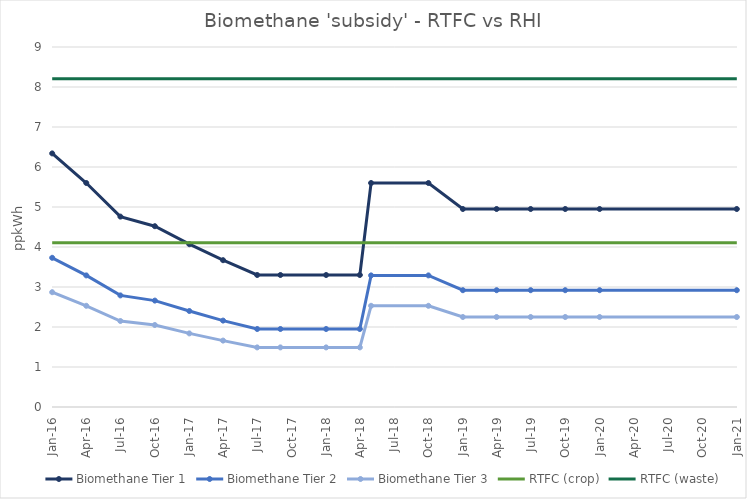
| Category | Biomethane Tier 1 | Biomethane Tier 2 | Biomethane Tier 3 | RTFC (crop) | RTFC (waste) |
|---|---|---|---|---|---|
| 2016-01-01 | 6.34 | 3.73 | 2.87 | 4.104 | 8.208 |
| 2016-04-01 | 5.6 | 3.29 | 2.53 | 4.104 | 8.208 |
| 2016-07-01 | 4.76 | 2.79 | 2.15 | 4.104 | 8.208 |
| 2016-10-01 | 4.52 | 2.66 | 2.05 | 4.104 | 8.208 |
| 2017-01-01 | 4.07 | 2.4 | 1.84 | 4.104 | 8.208 |
| 2017-04-01 | 3.67 | 2.16 | 1.66 | 4.104 | 8.208 |
| 2017-07-01 | 3.3 | 1.95 | 1.49 | 4.104 | 8.208 |
| 2017-09-01 | 3.3 | 1.95 | 1.49 | 4.104 | 8.208 |
| 2018-01-01 | 3.3 | 1.95 | 1.49 | 4.104 | 8.208 |
| 2018-04-01 | 3.3 | 1.95 | 1.49 | 4.104 | 8.208 |
| 2018-05-01 | 5.6 | 3.29 | 2.53 | 4.104 | 8.208 |
| 2018-10-01 | 5.6 | 3.29 | 2.53 | 4.104 | 8.208 |
| 2019-01-01 | 4.95 | 2.92 | 2.25 | 4.104 | 8.208 |
| 2019-04-01 | 4.95 | 2.92 | 2.25 | 4.104 | 8.208 |
| 2019-07-01 | 4.95 | 2.92 | 2.25 | 4.104 | 8.208 |
| 2019-10-01 | 4.95 | 2.92 | 2.25 | 4.104 | 8.208 |
| 2020-01-01 | 4.95 | 2.92 | 2.25 | 4.104 | 8.208 |
| 2021-01-01 | 4.95 | 2.92 | 2.25 | 4.104 | 8.208 |